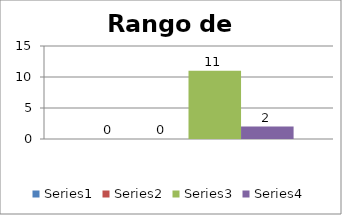
| Category | Series 0 | Series 1 | Series 2 | Series 3 |
|---|---|---|---|---|
| 0 | 0 | 0 | 11 | 2 |